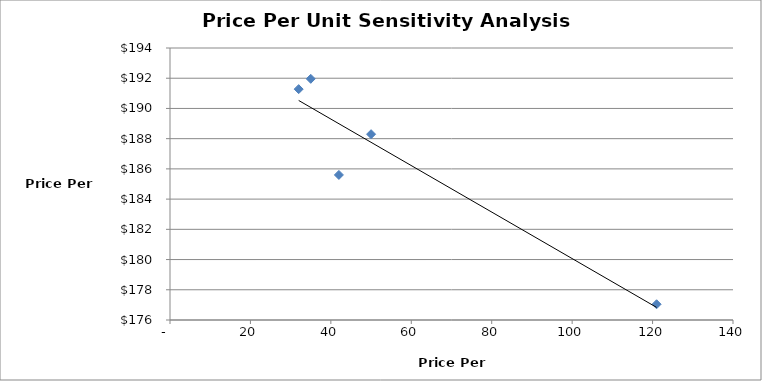
| Category | Series 0 |
|---|---|
| 121.0 | 177.042 |
| 42.0 | 185.6 |
| 50.0 | 188.297 |
| 32.0 | 191.278 |
| 35.0 | 191.96 |